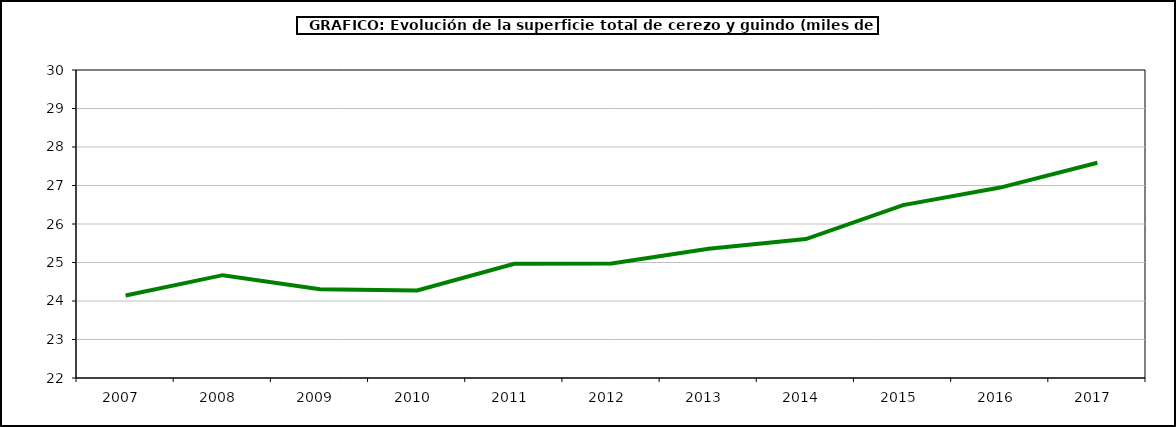
| Category | superficie cerezo y guindo |
|---|---|
| 2007.0 | 24.144 |
| 2008.0 | 24.671 |
| 2009.0 | 24.304 |
| 2010.0 | 24.275 |
| 2011.0 | 24.967 |
| 2012.0 | 24.972 |
| 2013.0 | 25.358 |
| 2014.0 | 25.608 |
| 2015.0 | 26.49 |
| 2016.0 | 26.946 |
| 2017.0 | 27.592 |